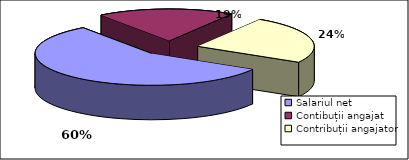
| Category | Series 0 |
|---|---|
| Salariul net | 749.4 |
| Contibuții angajat | 250.6 |
| Contribuții angajator | 322.18 |